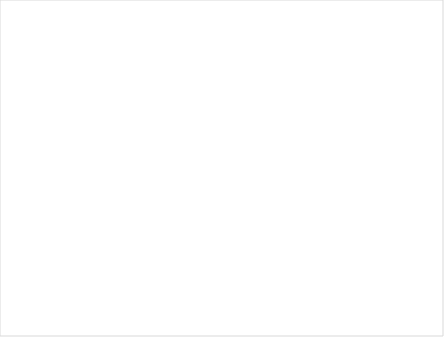
| Category | Total |
|---|---|
| Yes | 88 |
| Not Enough | 19 |
| Too much | 10 |